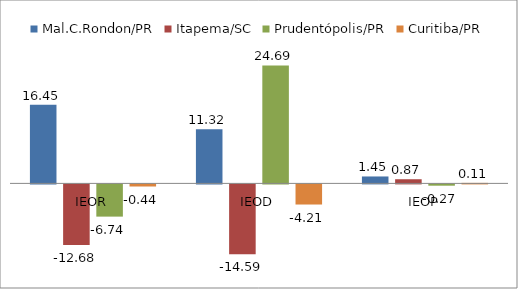
| Category | Mal.C.Rondon/PR | Itapema/SC | Prudentópolis/PR | Toledo/PR | Cascavel/PR | Curitiba/PR |
|---|---|---|---|---|---|---|
| IEOR | 16.45 | -12.68 | -6.74 |  |  | -0.44 |
| IEOD | 11.32 | -14.59 | 24.69 |  |  | -4.21 |
| IEOP | 1.45 | 0.87 | -0.27 |  |  | 0.11 |